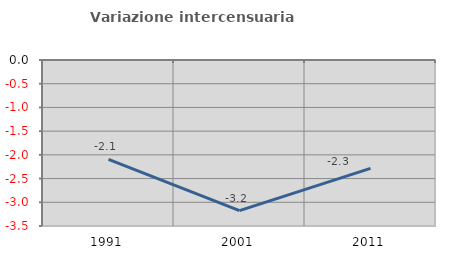
| Category | Variazione intercensuaria annua |
|---|---|
| 1991.0 | -2.094 |
| 2001.0 | -3.176 |
| 2011.0 | -2.285 |